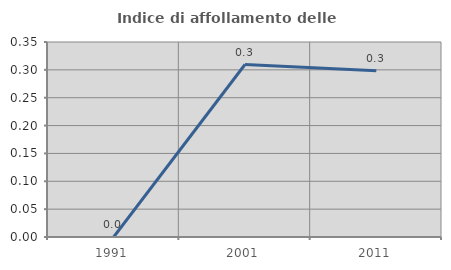
| Category | Indice di affollamento delle abitazioni  |
|---|---|
| 1991.0 | 0 |
| 2001.0 | 0.31 |
| 2011.0 | 0.299 |